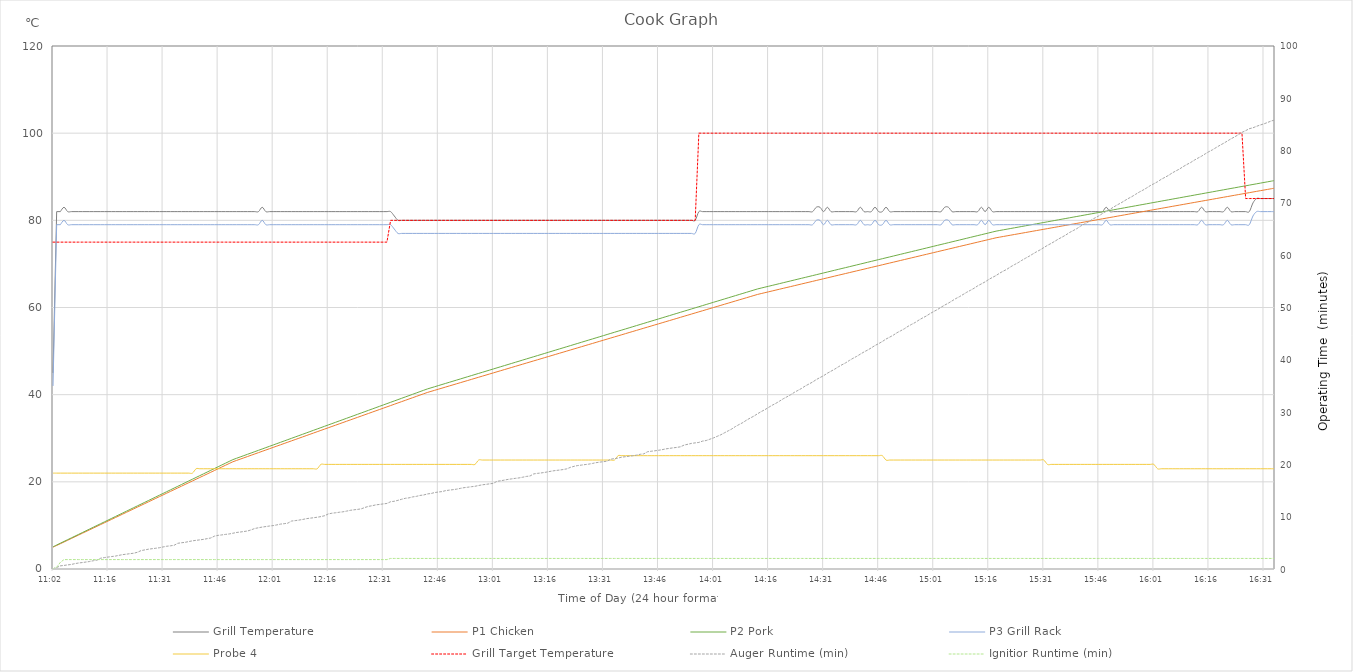
| Category | Grill Temperature | P1 Chicken | P2 Pork | P3 Grill Rack | Probe 4 | Grill Target Temperature |
|---|---|---|---|---|---|---|
| 2024-01-13 11:02:24 | 45 | 5 | 5.1 | 42 | 22 | 75 |
| 2024-01-13 11:02:44 | 82 | 5.4 | 5.508 | 79 | 22 | 75 |
| 2024-01-13 11:03:44 | 82 | 5.8 | 5.916 | 79 | 22 | 75 |
| 2024-01-13 11:04:44 | 83 | 6.2 | 6.324 | 80 | 22 | 75 |
| 2024-01-13 11:05:44 | 82 | 6.6 | 6.732 | 79 | 22 | 75 |
| 2024-01-13 11:06:44 | 82 | 7 | 7.14 | 79 | 22 | 75 |
| 2024-01-13 11:07:44 | 82 | 7.4 | 7.548 | 79 | 22 | 75 |
| 2024-01-13 11:08:44 | 82 | 7.8 | 7.956 | 79 | 22 | 75 |
| 2024-01-13 11:09:44 | 82 | 8.2 | 8.364 | 79 | 22 | 75 |
| 2024-01-13 11:10:44 | 82 | 8.6 | 8.772 | 79 | 22 | 75 |
| 2024-01-13 11:11:44 | 82 | 9 | 9.18 | 79 | 22 | 75 |
| 2024-01-13 11:12:44 | 82 | 9.4 | 9.588 | 79 | 22 | 75 |
| 2024-01-13 11:13:44 | 82 | 9.8 | 9.996 | 79 | 22 | 75 |
| 2024-01-13 11:14:44 | 82 | 10.2 | 10.404 | 79 | 22 | 75 |
| 2024-01-13 11:15:44 | 82 | 10.6 | 10.812 | 79 | 22 | 75 |
| 2024-01-13 11:16:44 | 82 | 11 | 11.22 | 79 | 22 | 75 |
| 2024-01-13 11:17:44 | 82 | 11.4 | 11.628 | 79 | 22 | 75 |
| 2024-01-13 11:18:44 | 82 | 11.8 | 12.036 | 79 | 22 | 75 |
| 2024-01-13 11:19:44 | 82 | 12.2 | 12.444 | 79 | 22 | 75 |
| 2024-01-13 11:20:44 | 82 | 12.6 | 12.852 | 79 | 22 | 75 |
| 2024-01-13 11:21:44 | 82 | 13 | 13.26 | 79 | 22 | 75 |
| 2024-01-13 11:22:44 | 82 | 13.4 | 13.668 | 79 | 22 | 75 |
| 2024-01-13 11:23:44 | 82 | 13.8 | 14.076 | 79 | 22 | 75 |
| 2024-01-13 11:24:44 | 82 | 14.2 | 14.484 | 79 | 22 | 75 |
| 2024-01-13 11:25:44 | 82 | 14.6 | 14.892 | 79 | 22 | 75 |
| 2024-01-13 11:26:44 | 82 | 15 | 15.3 | 79 | 22 | 75 |
| 2024-01-13 11:27:44 | 82 | 15.4 | 15.708 | 79 | 22 | 75 |
| 2024-01-13 11:28:44 | 82 | 15.8 | 16.116 | 79 | 22 | 75 |
| 2024-01-13 11:29:44 | 82 | 16.2 | 16.524 | 79 | 22 | 75 |
| 2024-01-13 11:30:44 | 82 | 16.6 | 16.932 | 79 | 22 | 75 |
| 2024-01-13 11:31:44 | 82 | 17 | 17.34 | 79 | 22 | 75 |
| 2024-01-13 11:32:44 | 82 | 17.4 | 17.748 | 79 | 22 | 75 |
| 2024-01-13 11:33:44 | 82 | 17.8 | 18.156 | 79 | 22 | 75 |
| 2024-01-13 11:34:44 | 82 | 18.2 | 18.564 | 79 | 22 | 75 |
| 2024-01-13 11:35:44 | 82 | 18.6 | 18.972 | 79 | 22 | 75 |
| 2024-01-13 11:36:44 | 82 | 19 | 19.38 | 79 | 22 | 75 |
| 2024-01-13 11:37:44 | 82 | 19.4 | 19.788 | 79 | 22 | 75 |
| 2024-01-13 11:38:44 | 82 | 19.8 | 20.196 | 79 | 22 | 75 |
| 2024-01-13 11:39:44 | 82 | 20.2 | 20.604 | 79 | 22 | 75 |
| 2024-01-13 11:40:44 | 82 | 20.6 | 21.012 | 79 | 23 | 75 |
| 2024-01-13 11:41:44 | 82 | 21 | 21.42 | 79 | 23 | 75 |
| 2024-01-13 11:42:44 | 82 | 21.4 | 21.828 | 79 | 23 | 75 |
| 2024-01-13 11:43:44 | 82 | 21.8 | 22.236 | 79 | 23 | 75 |
| 2024-01-13 11:44:44 | 82 | 22.2 | 22.644 | 79 | 23 | 75 |
| 2024-01-13 11:45:44 | 82 | 22.6 | 23.052 | 79 | 23 | 75 |
| 2024-01-13 11:46:44 | 82 | 23 | 23.46 | 79 | 23 | 75 |
| 2024-01-13 11:47:44 | 82 | 23.4 | 23.868 | 79 | 23 | 75 |
| 2024-01-13 11:48:44 | 82 | 23.8 | 24.276 | 79 | 23 | 75 |
| 2024-01-13 11:49:44 | 82 | 24.2 | 24.684 | 79 | 23 | 75 |
| 2024-01-13 11:50:44 | 82 | 24.6 | 25.092 | 79 | 23 | 75 |
| 2024-01-13 11:51:44 | 82 | 24.9 | 25.398 | 79 | 23 | 75 |
| 2024-01-13 11:52:44 | 82 | 25.2 | 25.704 | 79 | 23 | 75 |
| 2024-01-13 11:53:44 | 82 | 25.5 | 26.01 | 79 | 23 | 75 |
| 2024-01-13 11:54:44 | 82 | 25.8 | 26.316 | 79 | 23 | 75 |
| 2024-01-13 11:55:44 | 82 | 26.1 | 26.622 | 79 | 23 | 75 |
| 2024-01-13 11:56:44 | 82 | 26.4 | 26.928 | 79 | 23 | 75 |
| 2024-01-13 11:57:44 | 82 | 26.7 | 27.234 | 79 | 23 | 75 |
| 2024-01-13 11:58:44 | 83 | 27 | 27.54 | 80 | 23 | 75 |
| 2024-01-13 11:59:44 | 82 | 27.3 | 27.846 | 79 | 23 | 75 |
| 2024-01-13 12:00:44 | 82 | 27.6 | 28.152 | 79 | 23 | 75 |
| 2024-01-13 12:01:44 | 82 | 27.9 | 28.458 | 79 | 23 | 75 |
| 2024-01-13 12:02:44 | 82 | 28.2 | 28.764 | 79 | 23 | 75 |
| 2024-01-13 12:03:44 | 82 | 28.5 | 29.07 | 79 | 23 | 75 |
| 2024-01-13 12:04:44 | 82 | 28.8 | 29.376 | 79 | 23 | 75 |
| 2024-01-13 12:05:44 | 82 | 29.1 | 29.682 | 79 | 23 | 75 |
| 2024-01-13 12:06:44 | 82 | 29.4 | 29.988 | 79 | 23 | 75 |
| 2024-01-13 12:07:44 | 82 | 29.7 | 30.294 | 79 | 23 | 75 |
| 2024-01-13 12:08:44 | 82 | 30 | 30.6 | 79 | 23 | 75 |
| 2024-01-13 12:09:44 | 82 | 30.3 | 30.906 | 79 | 23 | 75 |
| 2024-01-13 12:10:44 | 82 | 30.6 | 31.212 | 79 | 23 | 75 |
| 2024-01-13 12:11:44 | 82 | 30.9 | 31.518 | 79 | 23 | 75 |
| 2024-01-13 12:12:44 | 82 | 31.2 | 31.824 | 79 | 23 | 75 |
| 2024-01-13 12:13:44 | 82 | 31.5 | 32.13 | 79 | 23 | 75 |
| 2024-01-13 12:14:44 | 82 | 31.8 | 32.436 | 79 | 24 | 75 |
| 2024-01-13 12:15:44 | 82 | 32.1 | 32.742 | 79 | 24 | 75 |
| 2024-01-13 12:16:44 | 82 | 32.4 | 33.048 | 79 | 24 | 75 |
| 2024-01-13 12:17:44 | 82 | 32.7 | 33.354 | 79 | 24 | 75 |
| 2024-01-13 12:18:44 | 82 | 33 | 33.66 | 79 | 24 | 75 |
| 2024-01-13 12:19:44 | 82 | 33.3 | 33.966 | 79 | 24 | 75 |
| 2024-01-13 12:20:44 | 82 | 33.6 | 34.272 | 79 | 24 | 75 |
| 2024-01-13 12:21:44 | 82 | 33.9 | 34.578 | 79 | 24 | 75 |
| 2024-01-13 12:22:44 | 82 | 34.2 | 34.884 | 79 | 24 | 75 |
| 2024-01-13 12:23:44 | 82 | 34.5 | 35.19 | 79 | 24 | 75 |
| 2024-01-13 12:24:44 | 82 | 34.8 | 35.496 | 79 | 24 | 75 |
| 2024-01-13 12:25:44 | 82 | 35.1 | 35.802 | 79 | 24 | 75 |
| 2024-01-13 12:26:44 | 82 | 35.4 | 36.108 | 79 | 24 | 75 |
| 2024-01-13 12:27:44 | 82 | 35.7 | 36.414 | 79 | 24 | 75 |
| 2024-01-13 12:28:44 | 82 | 36 | 36.72 | 79 | 24 | 75 |
| 2024-01-13 12:29:44 | 82 | 36.3 | 37.026 | 79 | 24 | 75 |
| 2024-01-13 12:30:44 | 82 | 36.6 | 37.332 | 79 | 24 | 75 |
| 2024-01-13 12:31:44 | 82 | 36.9 | 37.638 | 79 | 24 | 75 |
| 2024-01-13 12:32:44 | 82 | 37.2 | 37.944 | 79 | 24 | 75 |
| 2024-01-13 12:33:44 | 82 | 37.5 | 38.25 | 79 | 24 | 80 |
| 2024-01-13 12:34:44 | 81 | 37.8 | 38.556 | 78 | 24 | 80 |
| 2024-01-13 12:35:44 | 80 | 38.1 | 38.862 | 77 | 24 | 80 |
| 2024-01-13 12:36:44 | 80 | 38.4 | 39.168 | 77 | 24 | 80 |
| 2024-01-13 12:37:44 | 80 | 38.7 | 39.474 | 77 | 24 | 80 |
| 2024-01-13 12:38:44 | 80 | 39 | 39.78 | 77 | 24 | 80 |
| 2024-01-13 12:39:44 | 80 | 39.3 | 40.086 | 77 | 24 | 80 |
| 2024-01-13 12:40:44 | 80 | 39.6 | 40.392 | 77 | 24 | 80 |
| 2024-01-13 12:41:44 | 80 | 39.9 | 40.698 | 77 | 24 | 80 |
| 2024-01-13 12:42:44 | 80 | 40.2 | 41.004 | 77 | 24 | 80 |
| 2024-01-13 12:43:44 | 80 | 40.5 | 41.31 | 77 | 24 | 80 |
| 2024-01-13 12:44:44 | 80 | 40.75 | 41.565 | 77 | 24 | 80 |
| 2024-01-13 12:45:44 | 80 | 41 | 41.82 | 77 | 24 | 80 |
| 2024-01-13 12:46:44 | 80 | 41.25 | 42.075 | 77 | 24 | 80 |
| 2024-01-13 12:47:44 | 80 | 41.5 | 42.33 | 77 | 24 | 80 |
| 2024-01-13 12:48:44 | 80 | 41.75 | 42.585 | 77 | 24 | 80 |
| 2024-01-13 12:49:44 | 80 | 42 | 42.84 | 77 | 24 | 80 |
| 2024-01-13 12:50:44 | 80 | 42.25 | 43.095 | 77 | 24 | 80 |
| 2024-01-13 12:51:44 | 80 | 42.5 | 43.35 | 77 | 24 | 80 |
| 2024-01-13 12:52:44 | 80 | 42.75 | 43.605 | 77 | 24 | 80 |
| 2024-01-13 12:53:44 | 80 | 43 | 43.86 | 77 | 24 | 80 |
| 2024-01-13 12:54:44 | 80 | 43.25 | 44.115 | 77 | 24 | 80 |
| 2024-01-13 12:55:44 | 80 | 43.5 | 44.37 | 77 | 24 | 80 |
| 2024-01-13 12:56:44 | 80 | 43.75 | 44.625 | 77 | 24 | 80 |
| 2024-01-13 12:57:44 | 80 | 44 | 44.88 | 77 | 25 | 80 |
| 2024-01-13 12:58:44 | 80 | 44.25 | 45.135 | 77 | 25 | 80 |
| 2024-01-13 12:59:44 | 80 | 44.5 | 45.39 | 77 | 25 | 80 |
| 2024-01-13 13:00:44 | 80 | 44.75 | 45.645 | 77 | 25 | 80 |
| 2024-01-13 13:01:44 | 80 | 45 | 45.9 | 77 | 25 | 80 |
| 2024-01-13 13:02:44 | 80 | 45.25 | 46.155 | 77 | 25 | 80 |
| 2024-01-13 13:03:44 | 80 | 45.5 | 46.41 | 77 | 25 | 80 |
| 2024-01-13 13:04:44 | 80 | 45.75 | 46.665 | 77 | 25 | 80 |
| 2024-01-13 13:05:44 | 80 | 46 | 46.92 | 77 | 25 | 80 |
| 2024-01-13 13:06:44 | 80 | 46.25 | 47.175 | 77 | 25 | 80 |
| 2024-01-13 13:07:44 | 80 | 46.5 | 47.43 | 77 | 25 | 80 |
| 2024-01-13 13:08:44 | 80 | 46.75 | 47.685 | 77 | 25 | 80 |
| 2024-01-13 13:09:44 | 80 | 47 | 47.94 | 77 | 25 | 80 |
| 2024-01-13 13:10:44 | 80 | 47.25 | 48.195 | 77 | 25 | 80 |
| 2024-01-13 13:11:44 | 80 | 47.5 | 48.45 | 77 | 25 | 80 |
| 2024-01-13 13:12:44 | 80 | 47.75 | 48.705 | 77 | 25 | 80 |
| 2024-01-13 13:13:44 | 80 | 48 | 48.96 | 77 | 25 | 80 |
| 2024-01-13 13:14:44 | 80 | 48.25 | 49.215 | 77 | 25 | 80 |
| 2024-01-13 13:15:44 | 80 | 48.5 | 49.47 | 77 | 25 | 80 |
| 2024-01-13 13:16:44 | 80 | 48.75 | 49.725 | 77 | 25 | 80 |
| 2024-01-13 13:17:44 | 80 | 49 | 49.98 | 77 | 25 | 80 |
| 2024-01-13 13:18:44 | 80 | 49.25 | 50.235 | 77 | 25 | 80 |
| 2024-01-13 13:19:44 | 80 | 49.5 | 50.49 | 77 | 25 | 80 |
| 2024-01-13 13:20:44 | 80 | 49.75 | 50.745 | 77 | 25 | 80 |
| 2024-01-13 13:21:44 | 80 | 50 | 51 | 77 | 25 | 80 |
| 2024-01-13 13:22:44 | 80 | 50.25 | 51.255 | 77 | 25 | 80 |
| 2024-01-13 13:23:44 | 80 | 50.5 | 51.51 | 77 | 25 | 80 |
| 2024-01-13 13:24:44 | 80 | 50.75 | 51.765 | 77 | 25 | 80 |
| 2024-01-13 13:25:44 | 80 | 51 | 52.02 | 77 | 25 | 80 |
| 2024-01-13 13:26:44 | 80 | 51.25 | 52.275 | 77 | 25 | 80 |
| 2024-01-13 13:27:44 | 80 | 51.5 | 52.53 | 77 | 25 | 80 |
| 2024-01-13 13:28:44 | 80 | 51.75 | 52.785 | 77 | 25 | 80 |
| 2024-01-13 13:29:44 | 80 | 52 | 53.04 | 77 | 25 | 80 |
| 2024-01-13 13:30:44 | 80 | 52.25 | 53.295 | 77 | 25 | 80 |
| 2024-01-13 13:31:44 | 80 | 52.5 | 53.55 | 77 | 25 | 80 |
| 2024-01-13 13:32:44 | 80 | 52.75 | 53.805 | 77 | 25 | 80 |
| 2024-01-13 13:33:44 | 80 | 53 | 54.06 | 77 | 25 | 80 |
| 2024-01-13 13:34:44 | 80 | 53.25 | 54.315 | 77 | 25 | 80 |
| 2024-01-13 13:35:44 | 80 | 53.5 | 54.57 | 77 | 26 | 80 |
| 2024-01-13 13:36:44 | 80 | 53.75 | 54.825 | 77 | 26 | 80 |
| 2024-01-13 13:37:44 | 80 | 54 | 55.08 | 77 | 26 | 80 |
| 2024-01-13 13:38:44 | 80 | 54.25 | 55.335 | 77 | 26 | 80 |
| 2024-01-13 13:39:44 | 80 | 54.5 | 55.59 | 77 | 26 | 80 |
| 2024-01-13 13:40:44 | 80 | 54.75 | 55.845 | 77 | 26 | 80 |
| 2024-01-13 13:41:44 | 80 | 55 | 56.1 | 77 | 26 | 80 |
| 2024-01-13 13:42:44 | 80 | 55.25 | 56.355 | 77 | 26 | 80 |
| 2024-01-13 13:43:44 | 80 | 55.5 | 56.61 | 77 | 26 | 80 |
| 2024-01-13 13:44:44 | 80 | 55.75 | 56.865 | 77 | 26 | 80 |
| 2024-01-13 13:45:44 | 80 | 56 | 57.12 | 77 | 26 | 80 |
| 2024-01-13 13:46:44 | 80 | 56.25 | 57.375 | 77 | 26 | 80 |
| 2024-01-13 13:47:44 | 80 | 56.5 | 57.63 | 77 | 26 | 80 |
| 2024-01-13 13:48:44 | 80 | 56.75 | 57.885 | 77 | 26 | 80 |
| 2024-01-13 13:49:44 | 80 | 57 | 58.14 | 77 | 26 | 80 |
| 2024-01-13 13:50:44 | 80 | 57.25 | 58.395 | 77 | 26 | 80 |
| 2024-01-13 13:51:44 | 80 | 57.5 | 58.65 | 77 | 26 | 80 |
| 2024-01-13 13:52:44 | 80 | 57.75 | 58.905 | 77 | 26 | 80 |
| 2024-01-13 13:53:44 | 80 | 58 | 59.16 | 77 | 26 | 80 |
| 2024-01-13 13:54:44 | 80 | 58.25 | 59.415 | 77 | 26 | 80 |
| 2024-01-13 13:55:44 | 80 | 58.5 | 59.67 | 77 | 26 | 80 |
| 2024-01-13 13:56:44 | 80 | 58.75 | 59.925 | 77 | 26 | 80 |
| 2024-01-13 13:57:44 | 82 | 59 | 60.18 | 79 | 26 | 100 |
| 2024-01-13 13:58:44 | 82 | 59.25 | 60.435 | 79 | 26 | 100 |
| 2024-01-13 13:59:44 | 82 | 59.5 | 60.69 | 79 | 26 | 100 |
| 2024-01-13 14:00:44 | 82 | 59.75 | 60.945 | 79 | 26 | 100 |
| 2024-01-13 14:01:44 | 82 | 60 | 61.2 | 79 | 26 | 100 |
| 2024-01-13 14:02:44 | 82 | 60.25 | 61.455 | 79 | 26 | 100 |
| 2024-01-13 14:03:44 | 82 | 60.5 | 61.71 | 79 | 26 | 100 |
| 2024-01-13 14:04:44 | 82 | 60.75 | 61.965 | 79 | 26 | 100 |
| 2024-01-13 14:05:44 | 82 | 61 | 62.22 | 79 | 26 | 100 |
| 2024-01-13 14:06:44 | 82 | 61.25 | 62.475 | 79 | 26 | 100 |
| 2024-01-13 14:07:44 | 82 | 61.5 | 62.73 | 79 | 26 | 100 |
| 2024-01-13 14:08:44 | 82 | 61.75 | 62.985 | 79 | 26 | 100 |
| 2024-01-13 14:09:44 | 82 | 62 | 63.24 | 79 | 26 | 100 |
| 2024-01-13 14:10:44 | 82 | 62.25 | 63.495 | 79 | 26 | 100 |
| 2024-01-13 14:11:44 | 82 | 62.5 | 63.75 | 79 | 26 | 100 |
| 2024-01-13 14:12:44 | 82 | 62.75 | 64.005 | 79 | 26 | 100 |
| 2024-01-13 14:13:44 | 82 | 63 | 64.26 | 79 | 26 | 100 |
| 2024-01-13 14:14:44 | 82 | 63.2 | 64.464 | 79 | 26 | 100 |
| 2024-01-13 14:15:44 | 82 | 63.4 | 64.668 | 79 | 26 | 100 |
| 2024-01-13 14:16:44 | 82 | 63.6 | 64.872 | 79 | 26 | 100 |
| 2024-01-13 14:17:44 | 82 | 63.8 | 65.076 | 79 | 26 | 100 |
| 2024-01-13 14:18:44 | 82 | 64 | 65.28 | 79 | 26 | 100 |
| 2024-01-13 14:19:44 | 82 | 64.2 | 65.484 | 79 | 26 | 100 |
| 2024-01-13 14:20:44 | 82 | 64.4 | 65.688 | 79 | 26 | 100 |
| 2024-01-13 14:21:44 | 82 | 64.6 | 65.892 | 79 | 26 | 100 |
| 2024-01-13 14:22:44 | 82 | 64.8 | 66.096 | 79 | 26 | 100 |
| 2024-01-13 14:23:44 | 82 | 65 | 66.3 | 79 | 26 | 100 |
| 2024-01-13 14:24:44 | 82 | 65.2 | 66.504 | 79 | 26 | 100 |
| 2024-01-13 14:25:44 | 82 | 65.4 | 66.708 | 79 | 26 | 100 |
| 2024-01-13 14:26:44 | 82 | 65.6 | 66.912 | 79 | 26 | 100 |
| 2024-01-13 14:27:44 | 82 | 65.8 | 67.116 | 79 | 26 | 100 |
| 2024-01-13 14:28:44 | 82 | 66 | 67.32 | 79 | 26 | 100 |
| 2024-01-13 14:29:44 | 83 | 66.2 | 67.524 | 80 | 26 | 100 |
| 2024-01-13 14:30:44 | 83 | 66.4 | 67.728 | 80 | 26 | 100 |
| 2024-01-13 14:31:44 | 82 | 66.6 | 67.932 | 79 | 26 | 100 |
| 2024-01-13 14:32:44 | 83 | 66.8 | 68.136 | 80 | 26 | 100 |
| 2024-01-13 14:33:44 | 82 | 67 | 68.34 | 79 | 26 | 100 |
| 2024-01-13 14:34:44 | 82 | 67.2 | 68.544 | 79 | 26 | 100 |
| 2024-01-13 14:35:44 | 82 | 67.4 | 68.748 | 79 | 26 | 100 |
| 2024-01-13 14:36:44 | 82 | 67.6 | 68.952 | 79 | 26 | 100 |
| 2024-01-13 14:37:44 | 82 | 67.8 | 69.156 | 79 | 26 | 100 |
| 2024-01-13 14:38:44 | 82 | 68 | 69.36 | 79 | 26 | 100 |
| 2024-01-13 14:39:44 | 82 | 68.2 | 69.564 | 79 | 26 | 100 |
| 2024-01-13 14:40:44 | 82 | 68.4 | 69.768 | 79 | 26 | 100 |
| 2024-01-13 14:41:44 | 83 | 68.6 | 69.972 | 80 | 26 | 100 |
| 2024-01-13 14:42:44 | 82 | 68.8 | 70.176 | 79 | 26 | 100 |
| 2024-01-13 14:43:44 | 82 | 69 | 70.38 | 79 | 26 | 100 |
| 2024-01-13 14:44:44 | 82 | 69.2 | 70.584 | 79 | 26 | 100 |
| 2024-01-13 14:45:44 | 83 | 69.4 | 70.788 | 80 | 26 | 100 |
| 2024-01-13 14:46:44 | 82 | 69.6 | 70.992 | 79 | 26 | 100 |
| 2024-01-13 14:47:44 | 82 | 69.8 | 71.196 | 79 | 26 | 100 |
| 2024-01-13 14:48:44 | 83 | 70 | 71.4 | 80 | 25 | 100 |
| 2024-01-13 14:49:44 | 82 | 70.2 | 71.604 | 79 | 25 | 100 |
| 2024-01-13 14:50:44 | 82 | 70.4 | 71.808 | 79 | 25 | 100 |
| 2024-01-13 14:51:44 | 82 | 70.6 | 72.012 | 79 | 25 | 100 |
| 2024-01-13 14:52:44 | 82 | 70.8 | 72.216 | 79 | 25 | 100 |
| 2024-01-13 14:53:44 | 82 | 71 | 72.42 | 79 | 25 | 100 |
| 2024-01-13 14:54:44 | 82 | 71.2 | 72.624 | 79 | 25 | 100 |
| 2024-01-13 14:55:44 | 82 | 71.4 | 72.828 | 79 | 25 | 100 |
| 2024-01-13 14:56:44 | 82 | 71.6 | 73.032 | 79 | 25 | 100 |
| 2024-01-13 14:57:44 | 82 | 71.8 | 73.236 | 79 | 25 | 100 |
| 2024-01-13 14:58:44 | 82 | 72 | 73.44 | 79 | 25 | 100 |
| 2024-01-13 14:59:44 | 82 | 72.2 | 73.644 | 79 | 25 | 100 |
| 2024-01-13 15:00:44 | 82 | 72.4 | 73.848 | 79 | 25 | 100 |
| 2024-01-13 15:01:44 | 82 | 72.6 | 74.052 | 79 | 25 | 100 |
| 2024-01-13 15:02:44 | 82 | 72.8 | 74.256 | 79 | 25 | 100 |
| 2024-01-13 15:03:44 | 82 | 73 | 74.46 | 79 | 25 | 100 |
| 2024-01-13 15:04:44 | 83 | 73.2 | 74.664 | 80 | 25 | 100 |
| 2024-01-13 15:05:44 | 83 | 73.4 | 74.868 | 80 | 25 | 100 |
| 2024-01-13 15:06:44 | 82 | 73.6 | 75.072 | 79 | 25 | 100 |
| 2024-01-13 15:07:44 | 82 | 73.8 | 75.276 | 79 | 25 | 100 |
| 2024-01-13 15:08:44 | 82 | 74 | 75.48 | 79 | 25 | 100 |
| 2024-01-13 15:09:44 | 82 | 74.2 | 75.684 | 79 | 25 | 100 |
| 2024-01-13 15:10:44 | 82 | 74.4 | 75.888 | 79 | 25 | 100 |
| 2024-01-13 15:11:44 | 82 | 74.6 | 76.092 | 79 | 25 | 100 |
| 2024-01-13 15:12:44 | 82 | 74.8 | 76.296 | 79 | 25 | 100 |
| 2024-01-13 15:13:44 | 82 | 75 | 76.5 | 79 | 25 | 100 |
| 2024-01-13 15:14:44 | 83 | 75.2 | 76.704 | 80 | 25 | 100 |
| 2024-01-13 15:15:44 | 82 | 75.4 | 76.908 | 79 | 25 | 100 |
| 2024-01-13 15:16:44 | 83 | 75.6 | 77.112 | 80 | 25 | 100 |
| 2024-01-13 15:17:44 | 82 | 75.8 | 77.316 | 79 | 25 | 100 |
| 2024-01-13 15:18:44 | 82 | 76 | 77.52 | 79 | 25 | 100 |
| 2024-01-13 15:19:44 | 82 | 76.15 | 77.673 | 79 | 25 | 100 |
| 2024-01-13 15:20:44 | 82 | 76.3 | 77.826 | 79 | 25 | 100 |
| 2024-01-13 15:21:44 | 82 | 76.45 | 77.979 | 79 | 25 | 100 |
| 2024-01-13 15:22:44 | 82 | 76.6 | 78.132 | 79 | 25 | 100 |
| 2024-01-13 15:23:44 | 82 | 76.75 | 78.285 | 79 | 25 | 100 |
| 2024-01-13 15:24:44 | 82 | 76.9 | 78.438 | 79 | 25 | 100 |
| 2024-01-13 15:25:44 | 82 | 77.05 | 78.591 | 79 | 25 | 100 |
| 2024-01-13 15:26:44 | 82 | 77.2 | 78.744 | 79 | 25 | 100 |
| 2024-01-13 15:27:44 | 82 | 77.35 | 78.897 | 79 | 25 | 100 |
| 2024-01-13 15:28:44 | 82 | 77.5 | 79.05 | 79 | 25 | 100 |
| 2024-01-13 15:29:44 | 82 | 77.65 | 79.203 | 79 | 25 | 100 |
| 2024-01-13 15:30:44 | 82 | 77.8 | 79.356 | 79 | 25 | 100 |
| 2024-01-13 15:31:44 | 82 | 77.95 | 79.509 | 79 | 25 | 100 |
| 2024-01-13 15:32:44 | 82 | 78.1 | 79.662 | 79 | 24 | 100 |
| 2024-01-13 15:33:44 | 82 | 78.25 | 79.815 | 79 | 24 | 100 |
| 2024-01-13 15:34:44 | 82 | 78.4 | 79.968 | 79 | 24 | 100 |
| 2024-01-13 15:35:44 | 82 | 78.55 | 80.121 | 79 | 24 | 100 |
| 2024-01-13 15:36:44 | 82 | 78.7 | 80.274 | 79 | 24 | 100 |
| 2024-01-13 15:37:44 | 82 | 78.85 | 80.427 | 79 | 24 | 100 |
| 2024-01-13 15:38:44 | 82 | 79 | 80.58 | 79 | 24 | 100 |
| 2024-01-13 15:39:44 | 82 | 79.15 | 80.733 | 79 | 24 | 100 |
| 2024-01-13 15:40:44 | 82 | 79.3 | 80.886 | 79 | 24 | 100 |
| 2024-01-13 15:41:44 | 82 | 79.45 | 81.039 | 79 | 24 | 100 |
| 2024-01-13 15:42:44 | 82 | 79.6 | 81.192 | 79 | 24 | 100 |
| 2024-01-13 15:43:44 | 82 | 79.75 | 81.345 | 79 | 24 | 100 |
| 2024-01-13 15:44:44 | 82 | 79.9 | 81.498 | 79 | 24 | 100 |
| 2024-01-13 15:45:44 | 82 | 80.05 | 81.651 | 79 | 24 | 100 |
| 2024-01-13 15:46:44 | 82 | 80.2 | 81.804 | 79 | 24 | 100 |
| 2024-01-13 15:47:44 | 82 | 80.35 | 81.957 | 79 | 24 | 100 |
| 2024-01-13 15:48:44 | 83 | 80.5 | 82.11 | 80 | 24 | 100 |
| 2024-01-13 15:49:44 | 82 | 80.65 | 82.263 | 79 | 24 | 100 |
| 2024-01-13 15:50:44 | 82 | 80.8 | 82.416 | 79 | 24 | 100 |
| 2024-01-13 15:51:44 | 82 | 80.95 | 82.569 | 79 | 24 | 100 |
| 2024-01-13 15:52:44 | 82 | 81.1 | 82.722 | 79 | 24 | 100 |
| 2024-01-13 15:53:44 | 82 | 81.25 | 82.875 | 79 | 24 | 100 |
| 2024-01-13 15:54:44 | 82 | 81.4 | 83.028 | 79 | 24 | 100 |
| 2024-01-13 15:55:44 | 82 | 81.55 | 83.181 | 79 | 24 | 100 |
| 2024-01-13 15:56:44 | 82 | 81.7 | 83.334 | 79 | 24 | 100 |
| 2024-01-13 15:57:44 | 82 | 81.85 | 83.487 | 79 | 24 | 100 |
| 2024-01-13 15:58:44 | 82 | 82 | 83.64 | 79 | 24 | 100 |
| 2024-01-13 15:59:44 | 82 | 82.15 | 83.793 | 79 | 24 | 100 |
| 2024-01-13 16:00:44 | 82 | 82.3 | 83.946 | 79 | 24 | 100 |
| 2024-01-13 16:01:44 | 82 | 82.45 | 84.099 | 79 | 24 | 100 |
| 2024-01-13 16:02:44 | 82 | 82.6 | 84.252 | 79 | 23 | 100 |
| 2024-01-13 16:03:44 | 82 | 82.75 | 84.405 | 79 | 23 | 100 |
| 2024-01-13 16:04:44 | 82 | 82.9 | 84.558 | 79 | 23 | 100 |
| 2024-01-13 16:05:44 | 82 | 83.05 | 84.711 | 79 | 23 | 100 |
| 2024-01-13 16:06:44 | 82 | 83.2 | 84.864 | 79 | 23 | 100 |
| 2024-01-13 16:07:44 | 82 | 83.35 | 85.017 | 79 | 23 | 100 |
| 2024-01-13 16:08:44 | 82 | 83.5 | 85.17 | 79 | 23 | 100 |
| 2024-01-13 16:09:44 | 82 | 83.65 | 85.323 | 79 | 23 | 100 |
| 2024-01-13 16:10:44 | 82 | 83.8 | 85.476 | 79 | 23 | 100 |
| 2024-01-13 16:11:44 | 82 | 83.95 | 85.629 | 79 | 23 | 100 |
| 2024-01-13 16:12:44 | 82 | 84.1 | 85.782 | 79 | 23 | 100 |
| 2024-01-13 16:13:44 | 82 | 84.25 | 85.935 | 79 | 23 | 100 |
| 2024-01-13 16:14:44 | 83 | 84.4 | 86.088 | 80 | 23 | 100 |
| 2024-01-13 16:15:44 | 82 | 84.55 | 86.241 | 79 | 23 | 100 |
| 2024-01-13 16:16:44 | 82 | 84.7 | 86.394 | 79 | 23 | 100 |
| 2024-01-13 16:17:44 | 82 | 84.85 | 86.547 | 79 | 23 | 100 |
| 2024-01-13 16:18:44 | 82 | 85 | 86.7 | 79 | 23 | 100 |
| 2024-01-13 16:19:44 | 82 | 85.15 | 86.853 | 79 | 23 | 100 |
| 2024-01-13 16:20:44 | 82 | 85.3 | 87.006 | 79 | 23 | 100 |
| 2024-01-13 16:21:44 | 83 | 85.45 | 87.159 | 80 | 23 | 100 |
| 2024-01-13 16:22:44 | 82 | 85.6 | 87.312 | 79 | 23 | 100 |
| 2024-01-13 16:23:44 | 82 | 85.75 | 87.465 | 79 | 23 | 100 |
| 2024-01-13 16:24:44 | 82 | 85.9 | 87.618 | 79 | 23 | 100 |
| 2024-01-13 16:25:44 | 82 | 86.05 | 87.771 | 79 | 23 | 100 |
| 2024-01-13 16:26:44 | 82 | 86.2 | 87.924 | 79 | 23 | 85 |
| 2024-01-13 16:27:44 | 82 | 86.35 | 88.077 | 79 | 23 | 85 |
| 2024-01-13 16:28:45 | 84 | 86.5 | 88.23 | 81 | 23 | 85 |
| 2024-01-13 16:29:44 | 85 | 86.65 | 88.383 | 82 | 23 | 85 |
| 2024-01-13 16:30:44 | 85 | 86.8 | 88.536 | 82 | 23 | 85 |
| 2024-01-13 16:31:44 | 85 | 86.95 | 88.689 | 82 | 23 | 85 |
| 2024-01-13 16:32:44 | 85 | 87.1 | 88.842 | 82 | 23 | 85 |
| 2024-01-13 16:33:44 | 85 | 87.25 | 88.995 | 82 | 23 | 85 |
| 2024-01-13 16:34:44 | 85 | 87.4 | 89.148 | 82 | 23 | 85 |